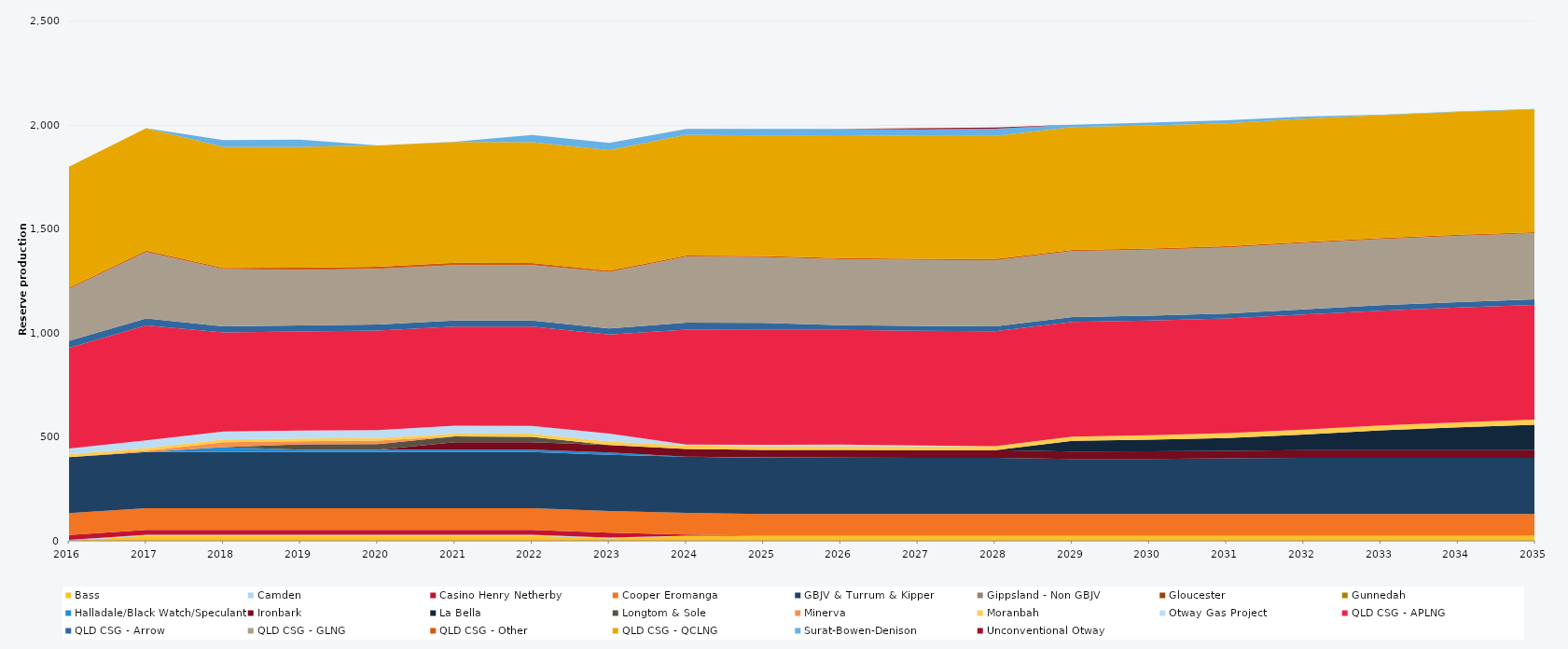
| Category | Bass | Camden | Casino Henry Netherby | Cooper Eromanga | GBJV & Turrum & Kipper | Gippsland - Non GBJV | Gloucester | Gunnedah | Halladale/Black Watch/Speculant | Ironbark | La Bella | Longtom & Sole | Minerva | Moranbah | Otway Gas Project | QLD CSG - APLNG | QLD CSG - Arrow | QLD CSG - GLNG | QLD CSG - Other | QLD CSG - QCLNG | Surat-Bowen-Denison | Unconventional Otway |
|---|---|---|---|---|---|---|---|---|---|---|---|---|---|---|---|---|---|---|---|---|---|---|
| 2016 | 0 | 5 | 23.12 | 105 | 270 | 0 | 0 | 0 | 0 | 0 | 0 | 0 | 0 | 12.859 | 27.952 | 484.723 | 34.038 | 250.558 | 5.856 | 581.852 | 0 | 0 |
| 2017 | 24.455 | 5 | 23.12 | 105 | 270 | 0 | 0 | 0 | 0 | 0 | 0 | 0 | 5.691 | 12.863 | 38 | 552.245 | 33.945 | 320.277 | 5.84 | 589.736 | 0 | 0 |
| 2018 | 24.455 | 5 | 23.12 | 105 | 270 | 0 | 0 | 0 | 23.725 | 0 | 0 | 0 | 23.725 | 13.029 | 38 | 477.621 | 28.853 | 276.028 | 5.84 | 582.423 | 31.885 | 0 |
| 2019 | 24.455 | 5 | 23.12 | 105 | 270 | 0 | 0 | 0 | 10.95 | 0 | 0 | 26.378 | 14.764 | 12.796 | 38 | 477.621 | 28.853 | 267.309 | 10.403 | 581.21 | 34.93 | 0 |
| 2020 | 24.522 | 5 | 23.12 | 105 | 270 | 0 | 0 | 0 | 10.95 | 0 | 0 | 27.45 | 16.571 | 12.768 | 38 | 478.929 | 28.932 | 268.203 | 10.419 | 582.685 | 0 | 0 |
| 2021 | 24.455 | 5 | 23.12 | 105 | 270 | 0 | 0 | 0 | 10.95 | 36.5 | 0 | 27.375 | 0 | 13.526 | 38 | 477.621 | 28.853 | 267.498 | 10.403 | 581.226 | 2 | 0 |
| 2022 | 24.455 | 5 | 23.12 | 105 | 270 | 0 | 0 | 0 | 10.95 | 36.5 | 0 | 25.279 | 0 | 15.305 | 38 | 477.621 | 28.853 | 267.149 | 10.403 | 581.126 | 34.93 | 0 |
| 2023 | 10.85 | 5 | 23.12 | 105 | 270 | 0 | 0 | 0 | 10.95 | 36.5 | 0 | 0 | 0 | 16.282 | 38 | 477.621 | 28.853 | 271.923 | 5.84 | 580.961 | 34.93 | 0 |
| 2024 | 24.522 | 0 | 5.3 | 105 | 270 | 0 | 0 | 0 | 0.173 | 36.6 | 0 | 0 | 0 | 16.806 | 4.516 | 553.758 | 34.038 | 317.367 | 5.856 | 580.633 | 27.848 | 0 |
| 2025 | 24.455 | 0 | 0 | 105 | 270 | 0 | 0 | 0 | 1.737 | 36.5 | 0 | 0 | 0 | 17.285 | 7.762 | 552.245 | 33.945 | 316.806 | 5.84 | 579.927 | 31.345 | 0 |
| 2026 | 24.455 | 0 | 0 | 105 | 270 | 0 | 0 | 0 | 1.462 | 36.5 | 0 | 0 | 0 | 17.534 | 8.342 | 552.245 | 22.876 | 316.704 | 5.84 | 591.753 | 29.688 | 0 |
| 2027 | 24.455 | 0 | 0 | 105 | 270 | 0 | 0 | 0 | 0.153 | 36.5 | 0 | 0 | 0 | 18.159 | 5.034 | 552.245 | 23.167 | 316.867 | 5.84 | 591.694 | 31.527 | 5.72 |
| 2028 | 24.522 | 0 | 0 | 105 | 270 | 0 | 0 | 0 | 0 | 36.6 | 0 | 0 | 0 | 19.008 | 0 | 553.758 | 23.513 | 317.838 | 5.856 | 593.235 | 34.537 | 5.28 |
| 2029 | 24.455 | 0 | 0 | 105 | 264.087 | 0 | 0 | 0 | 0 | 36.5 | 51.489 | 0 | 0 | 20.36 | 0 | 552.245 | 23.397 | 316.91 | 5.84 | 591.622 | 10.875 | 0 |
| 2030 | 24.455 | 0 | 0 | 105 | 264.931 | 0 | 0 | 0 | 0 | 36.5 | 56.072 | 0 | 0 | 21.622 | 0 | 552.245 | 23.644 | 317.293 | 5.84 | 591.579 | 14.285 | 0 |
| 2031 | 24.455 | 0 | 0 | 105 | 267.384 | 0 | 0 | 0 | 0 | 36.5 | 62.011 | 0 | 0 | 22.567 | 0 | 552.245 | 24.211 | 317.568 | 5.84 | 591.53 | 14.374 | 0 |
| 2032 | 24.522 | 0 | 0 | 105 | 270 | 0 | 0 | 0 | 0 | 36.6 | 75.825 | 0 | 0 | 23.484 | 0 | 553.758 | 25.31 | 318.7 | 5.856 | 593.07 | 10.005 | 0 |
| 2033 | 24.455 | 0 | 0 | 105 | 270 | 0 | 0 | 0 | 0 | 36.5 | 95.405 | 0 | 0 | 23.992 | 0 | 552.245 | 26.325 | 318.169 | 5.84 | 591.435 | 2.284 | 0 |
| 2034 | 24.455 | 0 | 0 | 105 | 270 | 0 | 0 | 0 | 0 | 36.5 | 110.058 | 0 | 0 | 24.563 | 0 | 552.245 | 26.511 | 318.356 | 5.84 | 591.394 | 1.651 | 0 |
| 2035 | 24.455 | 0 | 0 | 105 | 270 | 0 | 0 | 0 | 0 | 36.5 | 123.022 | 0 | 0 | 24.813 | 0 | 552.245 | 26.426 | 317.84 | 5.84 | 591.053 | 2.418 | 0 |